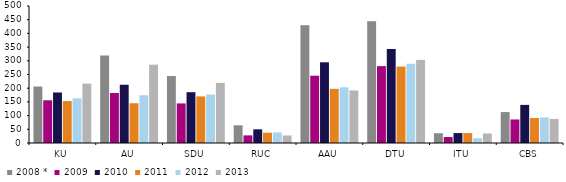
| Category | 2008 * | 2009 | 2010 | 2011 | 2012 | 2013 |
|---|---|---|---|---|---|---|
| KU | 206.124 | 155.911 | 184.407 | 152.858 | 162.912 | 216.841 |
| AU | 319.363 | 182.541 | 212.624 | 145.132 | 174.427 | 285.86 |
| SDU | 244.389 | 144.459 | 185.447 | 170.099 | 176.672 | 219.43 |
| RUC | 64.648 | 27.8 | 49.891 | 37.611 | 38.421 | 27.673 |
| AAU | 430.07 | 245.548 | 294.604 | 197.728 | 203.424 | 191.912 |
| DTU | 444.343 | 280.576 | 342.801 | 279.044 | 289.242 | 303.268 |
| ITU | 35.677 | 21.761 | 36.257 | 36.011 | 17.436 | 34.642 |
| CBS | 112.809 | 85.914 | 139.087 | 91.215 | 92.991 | 87.946 |